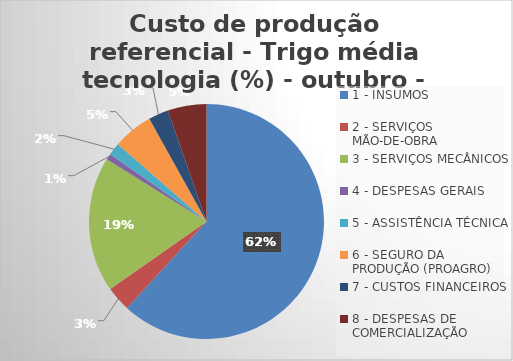
| Category | Series 0 |
|---|---|
| 1 - INSUMOS | 61.845 |
| 2 - SERVIÇOS MÃO-DE-OBRA | 3.429 |
| 3 - SERVIÇOS MECÂNICOS | 18.599 |
| 4 - DESPESAS GERAIS  | 0.839 |
| 5 - ASSISTÊNCIA TÉCNICA | 1.694 |
| 6 - SEGURO DA PRODUÇÃO (PROAGRO) | 5.506 |
| 7 - CUSTOS FINANCEIROS | 2.757 |
| 8 - DESPESAS DE COMERCIALIZAÇÃO | 5.331 |